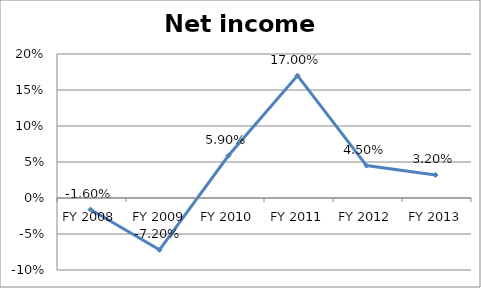
| Category | Net income ratio |
|---|---|
| FY 2013 | 0.032 |
| FY 2012 | 0.045 |
| FY 2011 | 0.17 |
| FY 2010 | 0.059 |
| FY 2009 | -0.072 |
| FY 2008 | -0.016 |